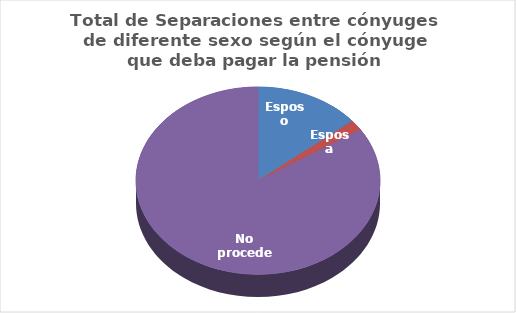
| Category | Series 0 |
|---|---|
| Esposo | 506 |
| Esposa | 65 |
| No procede | 3036 |